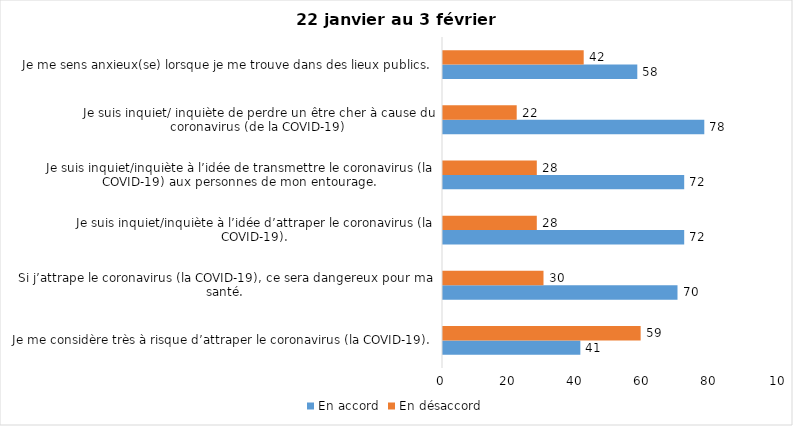
| Category | En accord | En désaccord |
|---|---|---|
| Je me considère très à risque d’attraper le coronavirus (la COVID-19). | 41 | 59 |
| Si j’attrape le coronavirus (la COVID-19), ce sera dangereux pour ma santé. | 70 | 30 |
| Je suis inquiet/inquiète à l’idée d’attraper le coronavirus (la COVID-19). | 72 | 28 |
| Je suis inquiet/inquiète à l’idée de transmettre le coronavirus (la COVID-19) aux personnes de mon entourage. | 72 | 28 |
| Je suis inquiet/ inquiète de perdre un être cher à cause du coronavirus (de la COVID-19) | 78 | 22 |
| Je me sens anxieux(se) lorsque je me trouve dans des lieux publics. | 58 | 42 |